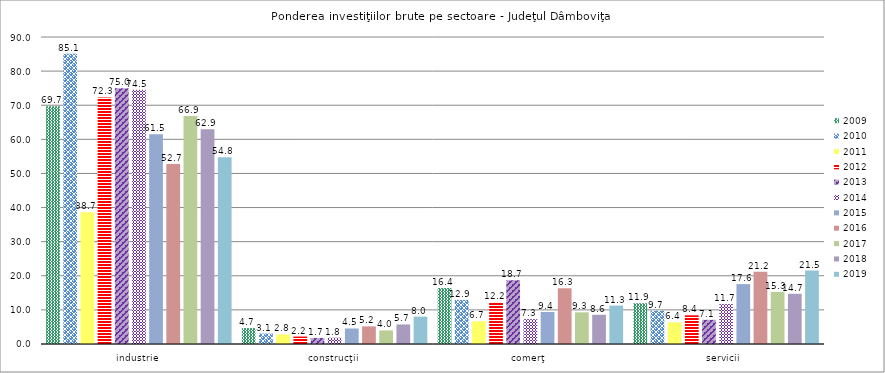
| Category | 2009 | 2010 | 2011 | 2012 | 2013 | 2014 | 2015 | 2016 | 2017 | 2018 | 2019 |
|---|---|---|---|---|---|---|---|---|---|---|---|
| industrie | 69.671 | 85.066 | 38.655 | 72.293 | 74.99 | 74.51 | 61.498 | 52.749 | 66.851 | 62.943 | 54.779 |
| construcţii | 4.662 | 3.074 | 2.804 | 2.182 | 1.74 | 1.836 | 4.55 | 5.165 | 3.975 | 5.725 | 8.018 |
| comerţ | 16.399 | 12.927 | 6.657 | 12.211 | 18.699 | 7.27 | 9.378 | 16.334 | 9.278 | 8.562 | 11.269 |
| servicii  | 11.947 | 9.746 | 6.35 | 8.415 | 7.085 | 11.683 | 17.557 | 21.174 | 15.28 | 14.717 | 21.521 |